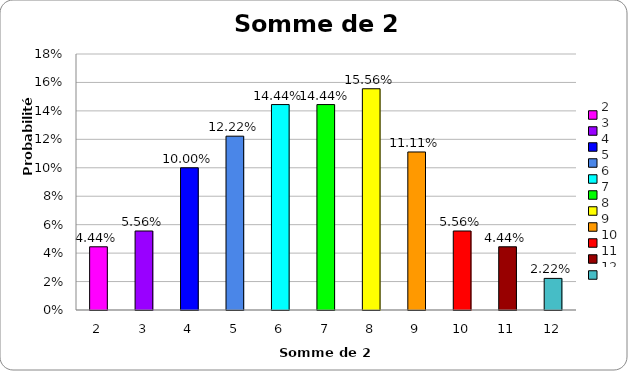
| Category | Probabilité 
fréquentielle (%) |
|---|---|
| 2.0 | 0.044 |
| 3.0 | 0.056 |
| 4.0 | 0.1 |
| 5.0 | 0.122 |
| 6.0 | 0.144 |
| 7.0 | 0.144 |
| 8.0 | 0.156 |
| 9.0 | 0.111 |
| 10.0 | 0.056 |
| 11.0 | 0.044 |
| 12.0 | 0.022 |